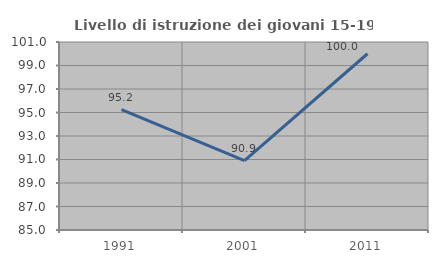
| Category | Livello di istruzione dei giovani 15-19 anni |
|---|---|
| 1991.0 | 95.238 |
| 2001.0 | 90.909 |
| 2011.0 | 100 |